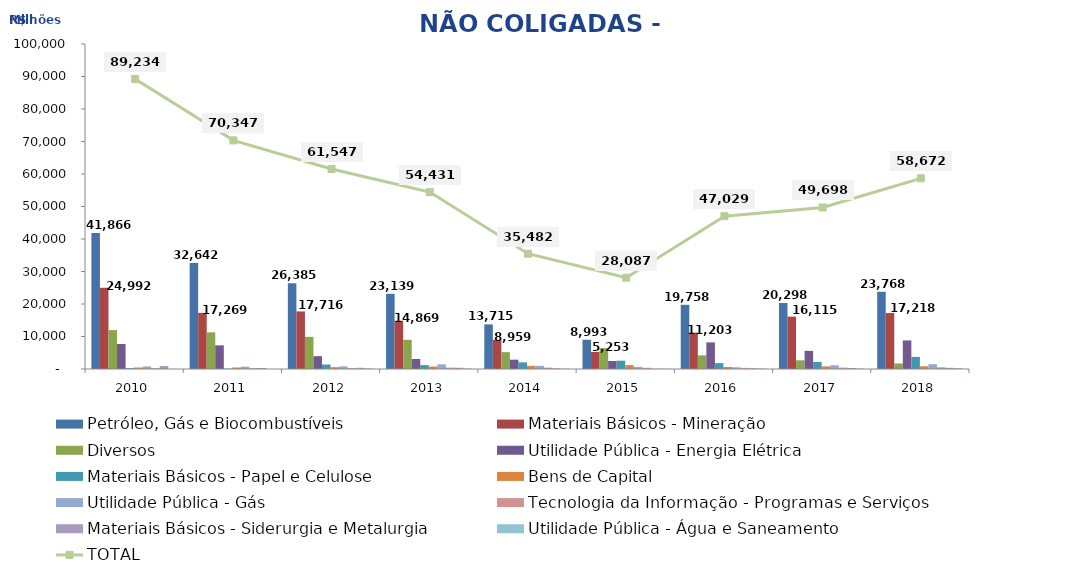
| Category | Petróleo, Gás e Biocombustíveis | Materiais Básicos - Mineração | Diversos | Utilidade Pública - Energia Elétrica | Materiais Básicos - Papel e Celulose | Bens de Capital | Utilidade Pública - Gás | Tecnologia da Informação - Programas e Serviços | Materiais Básicos - Siderurgia e Metalurgia | Utilidade Pública - Água e Saneamento |
|---|---|---|---|---|---|---|---|---|---|---|
| 2010.0 | 41865.559 | 24991.527 | 11960.939 | 7689.501 | 260.873 | 470.39 | 789.571 | 281.73 | 923.975 | 0 |
| 2011.0 | 32641.97 | 17268.993 | 11270.453 | 7280.707 | 121.075 | 462.835 | 717.792 | 276.869 | 305.965 | 0 |
| 2012.0 | 26385.044 | 17715.719 | 9898.235 | 3948.346 | 1387.453 | 572.977 | 807.516 | 257.944 | 381.289 | 192.7 |
| 2013.0 | 23138.854 | 14868.654 | 8968.244 | 3089.181 | 1192.786 | 753.897 | 1435.405 | 429.587 | 389.776 | 164.187 |
| 2014.0 | 13714.887 | 8959.479 | 5193.307 | 2869.446 | 2052.462 | 974.976 | 973.589 | 429.508 | 204.118 | 109.926 |
| 2015.0 | 8992.947 | 5252.653 | 6429.206 | 2470.104 | 2559.066 | 1193.272 | 647.492 | 375.959 | 99.301 | 66.587 |
| 2016.0 | 19758.427 | 11203.003 | 4193.972 | 8183.948 | 1806.769 | 630.633 | 519.955 | 345.768 | 227.458 | 158.66 |
| 2017.0 | 20298.246 | 16114.514 | 2681.283 | 5576.396 | 2154.14 | 802.805 | 1141.445 | 431.688 | 307.335 | 189.717 |
| 2018.0 | 23767.76 | 17217.869 | 1698.679 | 8787.983 | 3729.484 | 849.327 | 1476.716 | 515.752 | 365.412 | 262.665 |